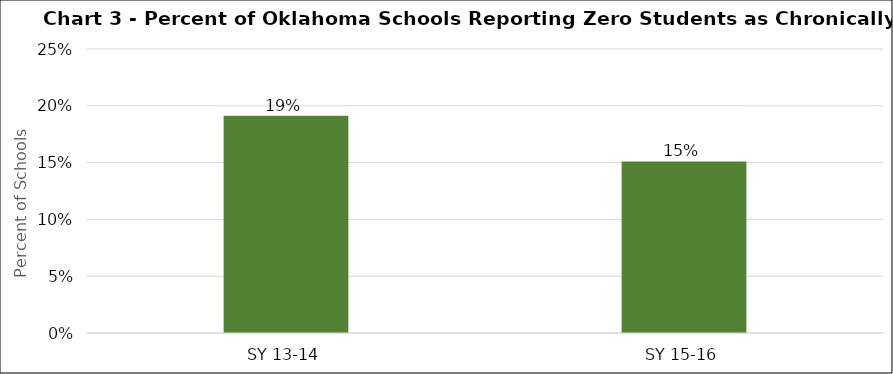
| Category | Series 0 |
|---|---|
| SY 13-14 | 0.191 |
| SY 15-16 | 0.151 |